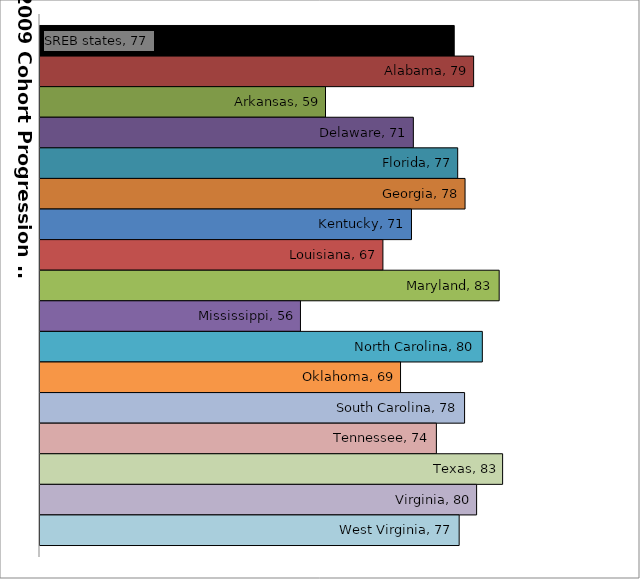
| Category | SREB states | Alabama | Arkansas | Delaware | Florida | Georgia | Kentucky | Louisiana | Maryland | Mississippi | North Carolina | Oklahoma | South Carolina | Tennessee | Texas | Virginia | West Virginia |
|---|---|---|---|---|---|---|---|---|---|---|---|---|---|---|---|---|---|
| 0 | 76.645 | 79.3 | 59.044 | 71.056 | 77.121 | 78.128 | 70.803 | 66.894 | 82.795 | 55.618 | 80.49 | 69.305 | 78.063 | 74.206 | 83.265 | 79.709 | 77.322 |